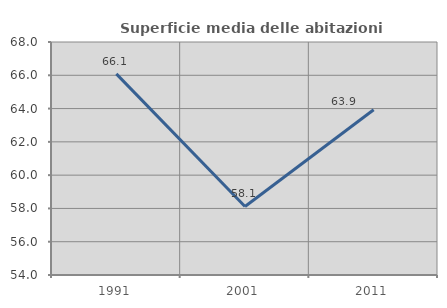
| Category | Superficie media delle abitazioni occupate |
|---|---|
| 1991.0 | 66.086 |
| 2001.0 | 58.118 |
| 2011.0 | 63.929 |